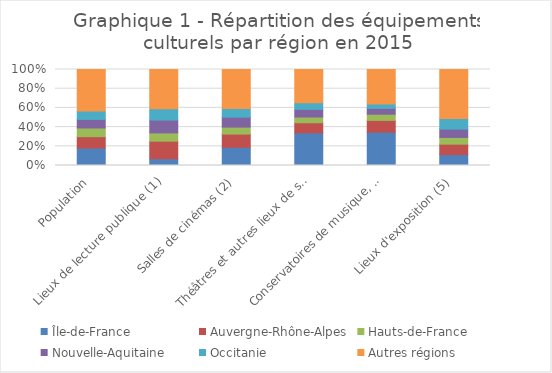
| Category | Île-de-France | Auvergne-Rhône-Alpes | Hauts-de-France | Nouvelle-Aquitaine | Occitanie | Autres régions |
|---|---|---|---|---|---|---|
| Population | 0.182 | 0.119 | 0.09 | 0.089 | 0.087 | 0.433 |
| Lieux de lecture publique (1) | 0.07 | 0.184 | 0.086 | 0.134 | 0.117 | 0.41 |
| Salles de cinémas (2) | 0.189 | 0.138 | 0.072 | 0.104 | 0.091 | 0.405 |
| Théâtres et autres lieux de spectacle (3) | 0.34 | 0.105 | 0.059 | 0.08 | 0.068 | 0.347 |
| Conservatoires de musique, danse et art dramatique (4) | 0.347 | 0.123 | 0.064 | 0.062 | 0.046 | 0.358 |
| Lieux d'exposition (5) | 0.114 | 0.109 | 0.07 | 0.087 | 0.11 | 0.511 |